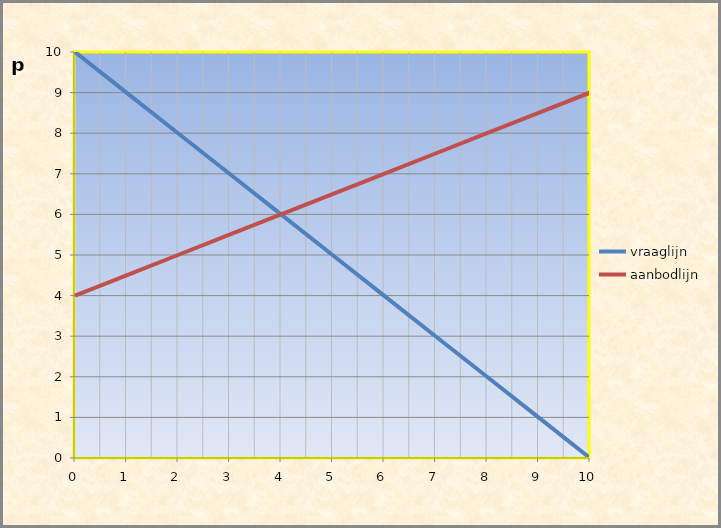
| Category | vraaglijn | aanbodlijn | Series 2 | Series 3 |
|---|---|---|---|---|
| 0.0 | 10 | 4 | 0 | 0 |
| 1.0 | 9 | 4.5 | 0 | 0 |
| 2.0 | 8 | 5 | 0 | 0 |
| 3.0 | 7 | 5.5 | 0 | 0 |
| 4.0 | 6 | 6 | 0 | 0 |
| 5.0 | 5 | 6.5 | 0 | 0 |
| 6.0 | 4 | 7 | 0 | 0 |
| 7.0 | 3 | 7.5 | 0 | 0 |
| 8.0 | 2 | 8 | 0 | 0 |
| 9.0 | 1 | 8.5 | 0 | 0 |
| 10.0 | 0 | 9 | 0 | 0 |